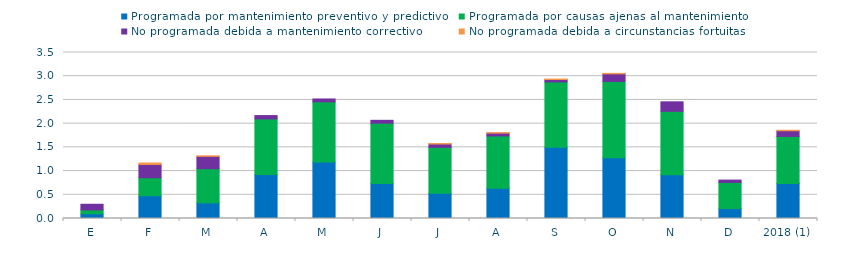
| Category | Programada por mantenimiento preventivo y predictivo | Programada por causas ajenas al mantenimiento  | No programada debida a mantenimiento correctivo  | No programada debida a circunstancias fortuitas  |
|---|---|---|---|---|
| E | 0.1 | 0.08 | 0.12 | 0 |
| F | 0.48 | 0.38 | 0.28 | 0.03 |
| M | 0.33 | 0.72 | 0.26 | 0.01 |
| A | 0.93 | 1.17 | 0.07 | 0 |
| M | 1.19 | 1.27 | 0.06 | 0 |
| J | 0.74 | 1.27 | 0.06 | 0 |
| J | 0.53 | 0.97 | 0.07 | 0.01 |
| A | 0.64 | 1.1 | 0.06 | 0.01 |
| S | 1.5 | 1.38 | 0.05 | 0.01 |
| O | 1.28 | 1.61 | 0.16 | 0.01 |
| N | 0.92 | 1.34 | 0.2 | 0 |
| D | 0.21 | 0.55 | 0.05 | 0 |
| 2018 (1) | 0.74 | 0.99 | 0.12 | 0.01 |